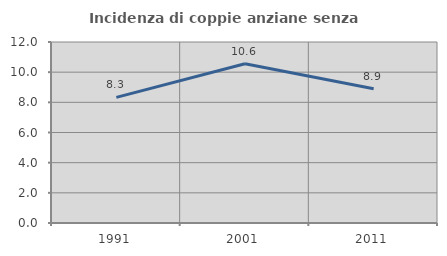
| Category | Incidenza di coppie anziane senza figli  |
|---|---|
| 1991.0 | 8.327 |
| 2001.0 | 10.557 |
| 2011.0 | 8.906 |